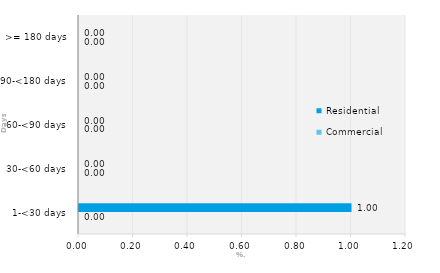
| Category | Commercial | Residential |
|---|---|---|
| 1-<30 days | 0 | 1 |
| 30-<60 days | 0 | 0 |
| 60-<90 days | 0 | 0 |
| 90-<180 days | 0 | 0 |
| >= 180 days | 0 | 0 |